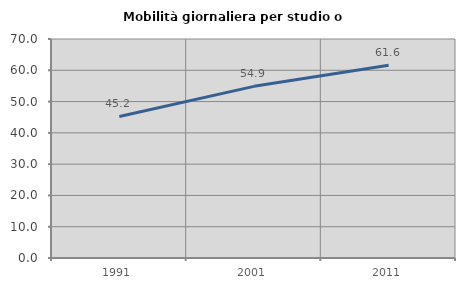
| Category | Mobilità giornaliera per studio o lavoro |
|---|---|
| 1991.0 | 45.238 |
| 2001.0 | 54.865 |
| 2011.0 | 61.61 |